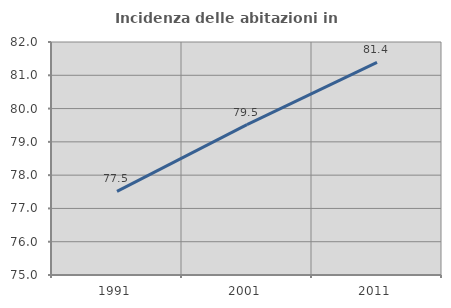
| Category | Incidenza delle abitazioni in proprietà  |
|---|---|
| 1991.0 | 77.515 |
| 2001.0 | 79.516 |
| 2011.0 | 81.389 |